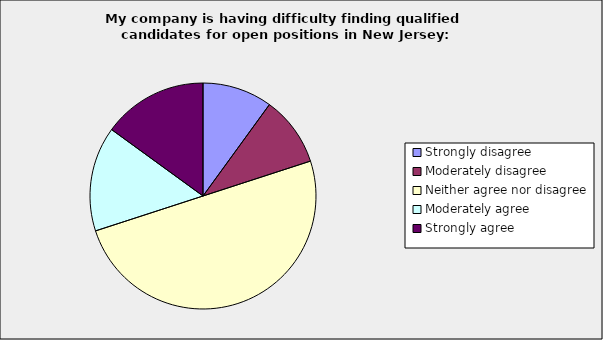
| Category | Series 0 |
|---|---|
| Strongly disagree | 0.1 |
| Moderately disagree | 0.1 |
| Neither agree nor disagree | 0.5 |
| Moderately agree | 0.15 |
| Strongly agree | 0.15 |